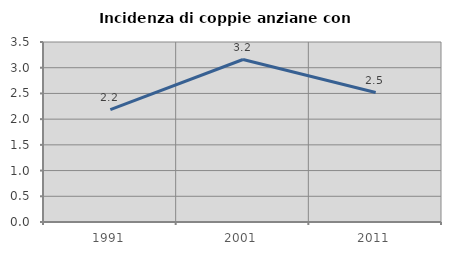
| Category | Incidenza di coppie anziane con figli |
|---|---|
| 1991.0 | 2.184 |
| 2001.0 | 3.159 |
| 2011.0 | 2.518 |